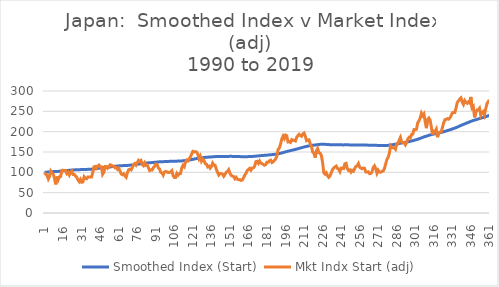
| Category | Smoothed Index (Start) | Mkt Indx Start (adj) |
|---|---|---|
| 1.0 | 100 | 100 |
| 2.0 | 100.277 | 95.009 |
| 3.0 | 100.525 | 92.327 |
| 4.0 | 100.685 | 83.714 |
| 5.0 | 100.903 | 89.615 |
| 6.0 | 101.255 | 103.093 |
| 7.0 | 101.56 | 98.68 |
| 8.0 | 101.832 | 95.544 |
| 9.0 | 101.995 | 84.944 |
| 10.0 | 102.012 | 70.298 |
| 11.0 | 102.223 | 89.835 |
| 12.0 | 102.353 | 81.782 |
| 13.0 | 102.555 | 89.133 |
| 14.0 | 102.763 | 89.835 |
| 15.0 | 103.12 | 104.889 |
| 16.0 | 103.478 | 105.226 |
| 17.0 | 103.827 | 104.633 |
| 18.0 | 104.174 | 104.616 |
| 19.0 | 104.441 | 96.813 |
| 20.0 | 104.735 | 99.715 |
| 21.0 | 104.963 | 93.34 |
| 22.0 | 105.255 | 99.833 |
| 23.0 | 105.579 | 103.32 |
| 24.0 | 105.818 | 94.942 |
| 25.0 | 106.054 | 94.875 |
| 26.0 | 106.251 | 91.042 |
| 27.0 | 106.414 | 87.826 |
| 28.0 | 106.51 | 81.331 |
| 29.0 | 106.564 | 77.117 |
| 30.0 | 106.673 | 82.573 |
| 31.0 | 106.71 | 75.537 |
| 32.0 | 106.755 | 76.388 |
| 33.0 | 106.925 | 88.859 |
| 34.0 | 107.055 | 85.042 |
| 35.0 | 107.177 | 84.191 |
| 36.0 | 107.339 | 88.414 |
| 37.0 | 107.5 | 88.358 |
| 38.0 | 107.664 | 88.752 |
| 39.0 | 107.826 | 88.69 |
| 40.0 | 108.099 | 99.947 |
| 41.0 | 108.507 | 113.575 |
| 42.0 | 108.921 | 114.445 |
| 43.0 | 109.29 | 110.269 |
| 44.0 | 109.712 | 115.782 |
| 45.0 | 110.152 | 117.842 |
| 46.0 | 110.542 | 113.161 |
| 47.0 | 110.931 | 113.358 |
| 48.0 | 111.139 | 95.448 |
| 49.0 | 111.397 | 100.665 |
| 50.0 | 111.791 | 114.421 |
| 51.0 | 112.184 | 114.514 |
| 52.0 | 112.529 | 110.034 |
| 53.0 | 112.901 | 112.953 |
| 54.0 | 113.326 | 118.534 |
| 55.0 | 113.74 | 117.738 |
| 56.0 | 114.125 | 115.081 |
| 57.0 | 114.509 | 115.271 |
| 58.0 | 114.849 | 111.069 |
| 59.0 | 115.193 | 111.741 |
| 60.0 | 115.491 | 107.321 |
| 61.0 | 115.817 | 110.341 |
| 62.0 | 116.075 | 103.762 |
| 63.0 | 116.252 | 95.937 |
| 64.0 | 116.41 | 94.071 |
| 65.0 | 116.591 | 96.455 |
| 66.0 | 116.72 | 91.375 |
| 67.0 | 116.813 | 87.913 |
| 68.0 | 117.017 | 99.031 |
| 69.0 | 117.293 | 106.351 |
| 70.0 | 117.58 | 107.757 |
| 71.0 | 117.849 | 105.99 |
| 72.0 | 118.172 | 111.661 |
| 73.0 | 118.567 | 119.055 |
| 74.0 | 118.986 | 121.721 |
| 75.0 | 119.361 | 117.702 |
| 76.0 | 119.798 | 123.979 |
| 77.0 | 120.287 | 129.594 |
| 78.0 | 120.747 | 126.969 |
| 79.0 | 121.226 | 129.244 |
| 80.0 | 121.604 | 119.412 |
| 81.0 | 121.949 | 116.389 |
| 82.0 | 122.36 | 123.193 |
| 83.0 | 122.71 | 117.348 |
| 84.0 | 123.067 | 118.399 |
| 85.0 | 123.354 | 111.558 |
| 86.0 | 123.567 | 104.333 |
| 87.0 | 123.797 | 106.145 |
| 88.0 | 124.02 | 105.688 |
| 89.0 | 124.298 | 111.317 |
| 90.0 | 124.613 | 115.125 |
| 91.0 | 124.979 | 120.524 |
| 92.0 | 125.336 | 119.858 |
| 93.0 | 125.602 | 110.963 |
| 94.0 | 125.841 | 108.507 |
| 95.0 | 125.995 | 100.126 |
| 96.0 | 126.133 | 98.664 |
| 97.0 | 126.215 | 93.095 |
| 98.0 | 126.376 | 101.1 |
| 99.0 | 126.545 | 101.988 |
| 100.0 | 126.706 | 101.287 |
| 101.0 | 126.847 | 99.417 |
| 102.0 | 126.991 | 99.795 |
| 103.0 | 127.146 | 101.031 |
| 104.0 | 127.331 | 104.109 |
| 105.0 | 127.39 | 91.648 |
| 106.0 | 127.406 | 87.361 |
| 107.0 | 127.422 | 87.383 |
| 108.0 | 127.537 | 97.251 |
| 109.0 | 127.608 | 92.96 |
| 110.0 | 127.717 | 96.844 |
| 111.0 | 127.826 | 96.927 |
| 112.0 | 128.073 | 110.733 |
| 113.0 | 128.382 | 117.143 |
| 114.0 | 128.656 | 113.825 |
| 115.0 | 129.035 | 124.547 |
| 116.0 | 129.468 | 130.142 |
| 117.0 | 129.878 | 128.216 |
| 118.0 | 130.333 | 132.955 |
| 119.0 | 130.835 | 137.949 |
| 120.0 | 131.401 | 144.687 |
| 121.0 | 132.033 | 151.611 |
| 122.0 | 132.644 | 150.075 |
| 123.0 | 133.259 | 150.805 |
| 124.0 | 133.861 | 149.906 |
| 125.0 | 134.407 | 144.674 |
| 126.0 | 134.837 | 133.491 |
| 127.0 | 135.324 | 139.555 |
| 128.0 | 135.687 | 127.368 |
| 129.0 | 136.099 | 132.604 |
| 130.0 | 136.477 | 129.417 |
| 131.0 | 136.773 | 121.511 |
| 132.0 | 137.054 | 120.181 |
| 133.0 | 137.266 | 113.436 |
| 134.0 | 137.494 | 115.198 |
| 135.0 | 137.671 | 110.27 |
| 136.0 | 137.887 | 114.291 |
| 137.0 | 138.184 | 122.568 |
| 138.0 | 138.431 | 117.755 |
| 139.0 | 138.67 | 117.124 |
| 140.0 | 138.81 | 107.385 |
| 141.0 | 138.875 | 99.907 |
| 142.0 | 138.873 | 93.335 |
| 143.0 | 138.909 | 97.125 |
| 144.0 | 138.941 | 96.735 |
| 145.0 | 138.961 | 95.536 |
| 146.0 | 138.93 | 90.383 |
| 147.0 | 138.943 | 94.84 |
| 148.0 | 139.008 | 100.129 |
| 149.0 | 139.098 | 102.599 |
| 150.0 | 139.228 | 106.589 |
| 151.0 | 139.269 | 97.848 |
| 152.0 | 139.256 | 92.517 |
| 153.0 | 139.226 | 90.738 |
| 154.0 | 139.184 | 89.532 |
| 155.0 | 139.089 | 84.261 |
| 156.0 | 139.031 | 87.782 |
| 157.0 | 138.929 | 83.408 |
| 158.0 | 138.811 | 81.731 |
| 159.0 | 138.696 | 82.04 |
| 160.0 | 138.563 | 79.996 |
| 161.0 | 138.444 | 81.404 |
| 162.0 | 138.373 | 86.157 |
| 163.0 | 138.376 | 93.445 |
| 164.0 | 138.42 | 97.583 |
| 165.0 | 138.533 | 104.489 |
| 166.0 | 138.669 | 106.925 |
| 167.0 | 138.834 | 109.784 |
| 168.0 | 138.953 | 105.439 |
| 169.0 | 139.122 | 110.414 |
| 170.0 | 139.296 | 111.062 |
| 171.0 | 139.508 | 115.041 |
| 172.0 | 139.831 | 126.204 |
| 173.0 | 140.16 | 127.074 |
| 174.0 | 140.439 | 122.217 |
| 175.0 | 140.77 | 127.728 |
| 176.0 | 141.047 | 122.43 |
| 177.0 | 141.313 | 121.549 |
| 178.0 | 141.553 | 119.212 |
| 179.0 | 141.776 | 117.578 |
| 180.0 | 142.014 | 119.219 |
| 181.0 | 142.307 | 124.967 |
| 182.0 | 142.596 | 124.72 |
| 183.0 | 142.919 | 128.293 |
| 184.0 | 143.255 | 129.779 |
| 185.0 | 143.531 | 124.137 |
| 186.0 | 143.824 | 125.868 |
| 187.0 | 144.152 | 129.657 |
| 188.0 | 144.51 | 132.826 |
| 189.0 | 144.939 | 140.239 |
| 190.0 | 145.528 | 156.469 |
| 191.0 | 146.148 | 159.989 |
| 192.0 | 146.864 | 170.027 |
| 193.0 | 147.7 | 182.498 |
| 194.0 | 148.596 | 189.014 |
| 195.0 | 149.428 | 183.237 |
| 196.0 | 150.337 | 191.572 |
| 197.0 | 151.225 | 190.013 |
| 198.0 | 151.954 | 174.686 |
| 199.0 | 152.685 | 175.38 |
| 200.0 | 153.393 | 173.594 |
| 201.0 | 154.164 | 180.386 |
| 202.0 | 154.91 | 178.403 |
| 203.0 | 155.657 | 179.006 |
| 204.0 | 156.382 | 177.283 |
| 205.0 | 157.187 | 185.882 |
| 206.0 | 158.032 | 190.24 |
| 207.0 | 158.902 | 193.49 |
| 208.0 | 159.734 | 190.176 |
| 209.0 | 160.545 | 188.609 |
| 210.0 | 161.409 | 194.518 |
| 211.0 | 162.288 | 196.548 |
| 212.0 | 163.083 | 188.768 |
| 213.0 | 163.763 | 177.83 |
| 214.0 | 164.457 | 179.609 |
| 215.0 | 165.149 | 179.95 |
| 216.0 | 165.738 | 170.087 |
| 217.0 | 166.261 | 163.931 |
| 218.0 | 166.637 | 149.577 |
| 219.0 | 166.988 | 147.254 |
| 220.0 | 167.227 | 136.285 |
| 221.0 | 167.629 | 152.829 |
| 222.0 | 168.085 | 158.477 |
| 223.0 | 168.44 | 148.704 |
| 224.0 | 168.776 | 146.949 |
| 225.0 | 169.055 | 141.565 |
| 226.0 | 169.155 | 123.841 |
| 227.0 | 169.006 | 98.929 |
| 228.0 | 168.823 | 95.571 |
| 229.0 | 168.675 | 98.821 |
| 230.0 | 168.455 | 91.633 |
| 231.0 | 168.198 | 87.711 |
| 232.0 | 167.976 | 91.02 |
| 233.0 | 167.835 | 98.958 |
| 234.0 | 167.769 | 106.409 |
| 235.0 | 167.745 | 110.546 |
| 236.0 | 167.748 | 113.258 |
| 237.0 | 167.772 | 115.385 |
| 238.0 | 167.739 | 109.647 |
| 239.0 | 167.69 | 108.084 |
| 240.0 | 167.579 | 101.731 |
| 241.0 | 167.554 | 110.332 |
| 242.0 | 167.524 | 109.801 |
| 243.0 | 167.488 | 109.24 |
| 244.0 | 167.57 | 120.946 |
| 245.0 | 167.663 | 122.167 |
| 246.0 | 167.626 | 109.153 |
| 247.0 | 167.544 | 104.624 |
| 248.0 | 167.474 | 105.898 |
| 249.0 | 167.353 | 100.579 |
| 250.0 | 167.274 | 104.818 |
| 251.0 | 167.175 | 102.714 |
| 252.0 | 167.143 | 109.326 |
| 253.0 | 167.162 | 114.469 |
| 254.0 | 167.198 | 116.114 |
| 255.0 | 167.288 | 121.615 |
| 256.0 | 167.287 | 112.5 |
| 257.0 | 167.265 | 110.431 |
| 258.0 | 167.227 | 108.909 |
| 259.0 | 167.208 | 110.601 |
| 260.0 | 167.18 | 109.782 |
| 261.0 | 167.062 | 100.764 |
| 262.0 | 166.944 | 100.715 |
| 263.0 | 166.833 | 101.329 |
| 264.0 | 166.678 | 96.823 |
| 265.0 | 166.528 | 97.181 |
| 266.0 | 166.416 | 100.977 |
| 267.0 | 166.416 | 112.048 |
| 268.0 | 166.455 | 115.944 |
| 269.0 | 166.427 | 109.299 |
| 270.0 | 166.286 | 97.943 |
| 271.0 | 166.218 | 105.153 |
| 272.0 | 166.106 | 100.724 |
| 273.0 | 165.991 | 100.319 |
| 274.0 | 165.897 | 102.324 |
| 275.0 | 165.812 | 103.194 |
| 276.0 | 165.784 | 108.827 |
| 277.0 | 165.868 | 120.049 |
| 278.0 | 166.065 | 131.428 |
| 279.0 | 166.312 | 136.525 |
| 280.0 | 166.655 | 146.282 |
| 281.0 | 167.181 | 164.783 |
| 282.0 | 167.662 | 160.645 |
| 283.0 | 168.138 | 160.515 |
| 284.0 | 168.609 | 160.24 |
| 285.0 | 169.04 | 156.675 |
| 286.0 | 169.606 | 170.405 |
| 287.0 | 170.168 | 170.43 |
| 288.0 | 170.819 | 179.626 |
| 289.0 | 171.529 | 185.982 |
| 290.0 | 172.117 | 174.301 |
| 291.0 | 172.688 | 173.067 |
| 292.0 | 173.261 | 173.522 |
| 293.0 | 173.771 | 167.689 |
| 294.0 | 174.335 | 173.33 |
| 295.0 | 174.984 | 182.293 |
| 296.0 | 175.667 | 186.167 |
| 297.0 | 176.33 | 184.543 |
| 298.0 | 177.072 | 192.911 |
| 299.0 | 177.819 | 193.956 |
| 300.0 | 178.673 | 205.086 |
| 301.0 | 179.518 | 204.875 |
| 302.0 | 180.369 | 205.943 |
| 303.0 | 181.373 | 221.784 |
| 304.0 | 182.416 | 226.469 |
| 305.0 | 183.525 | 233.69 |
| 306.0 | 184.744 | 245.479 |
| 307.0 | 185.893 | 239.261 |
| 308.0 | 187.076 | 243.467 |
| 309.0 | 188.071 | 225.48 |
| 310.0 | 188.891 | 208.613 |
| 311.0 | 189.922 | 230.326 |
| 312.0 | 190.979 | 233.538 |
| 313.0 | 191.982 | 228.894 |
| 314.0 | 192.808 | 211.819 |
| 315.0 | 193.429 | 192.008 |
| 316.0 | 194.14 | 201.278 |
| 317.0 | 194.836 | 200.279 |
| 318.0 | 195.585 | 206.145 |
| 319.0 | 196.132 | 186.372 |
| 320.0 | 196.79 | 197.906 |
| 321.0 | 197.455 | 198.99 |
| 322.0 | 198.123 | 199.671 |
| 323.0 | 198.891 | 210.278 |
| 324.0 | 199.77 | 221.811 |
| 325.0 | 200.72 | 229.49 |
| 326.0 | 201.668 | 229.958 |
| 327.0 | 202.632 | 232.105 |
| 328.0 | 203.575 | 230.719 |
| 329.0 | 204.54 | 233.627 |
| 330.0 | 205.555 | 239.195 |
| 331.0 | 206.633 | 246.247 |
| 332.0 | 207.715 | 247.262 |
| 333.0 | 208.787 | 247.118 |
| 334.0 | 209.96 | 257.829 |
| 335.0 | 211.265 | 271.848 |
| 336.0 | 212.601 | 275.841 |
| 337.0 | 213.971 | 280.136 |
| 338.0 | 215.361 | 283.07 |
| 339.0 | 216.636 | 272.56 |
| 340.0 | 217.847 | 266.965 |
| 341.0 | 219.145 | 276.424 |
| 342.0 | 220.387 | 271.78 |
| 343.0 | 221.6 | 269.703 |
| 344.0 | 222.84 | 273.195 |
| 345.0 | 224.044 | 270.457 |
| 346.0 | 225.39 | 285.447 |
| 347.0 | 226.458 | 258.56 |
| 348.0 | 227.553 | 261.916 |
| 349.0 | 228.372 | 235.164 |
| 350.0 | 229.302 | 246.736 |
| 351.0 | 230.289 | 253.138 |
| 352.0 | 231.273 | 253.359 |
| 353.0 | 232.291 | 257.545 |
| 354.0 | 233.134 | 240.738 |
| 355.0 | 234.038 | 247.393 |
| 356.0 | 234.959 | 249.644 |
| 357.0 | 235.789 | 241.223 |
| 358.0 | 236.76 | 255.788 |
| 359.0 | 237.851 | 268.557 |
| 360.0 | 238.987 | 273.78 |
| 361.0 | 240.156 | 277.747 |